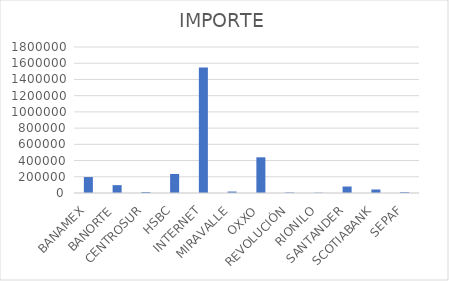
| Category | IMPORTE |
|---|---|
| BANAMEX | 196422.04 |
| BANORTE | 96749.37 |
| CENTROSUR | 12404 |
| HSBC | 234879.06 |
| INTERNET | 1546814.97 |
| MIRAVALLE | 17857 |
| OXXO | 439978.82 |
| REVOLUCIÓN | 6665 |
| RIONILO | 3899 |
| SANTANDER | 80063.6 |
| SCOTIABANK | 43125.25 |
| SEPAF | 11169.12 |